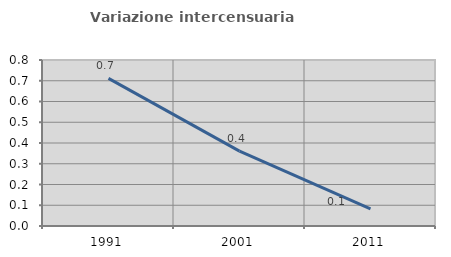
| Category | Variazione intercensuaria annua |
|---|---|
| 1991.0 | 0.712 |
| 2001.0 | 0.361 |
| 2011.0 | 0.082 |